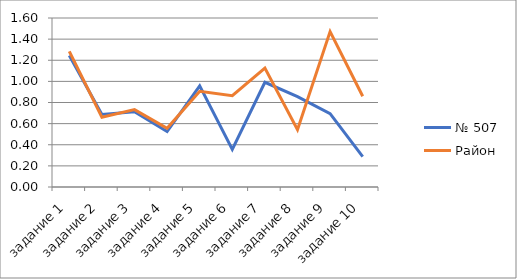
| Category | № 507 | Район |
|---|---|---|
| задание 1 | 1.246 | 1.284 |
| задание 2 | 0.686 | 0.661 |
| задание 3 | 0.712 | 0.733 |
| задание 4 | 0.525 | 0.555 |
| задание 5 | 0.958 | 0.906 |
| задание 6 | 0.356 | 0.865 |
| задание 7 | 0.992 | 1.127 |
| задание 8 | 0.856 | 0.543 |
| задание 9 | 0.695 | 1.472 |
| задание 10 | 0.288 | 0.859 |